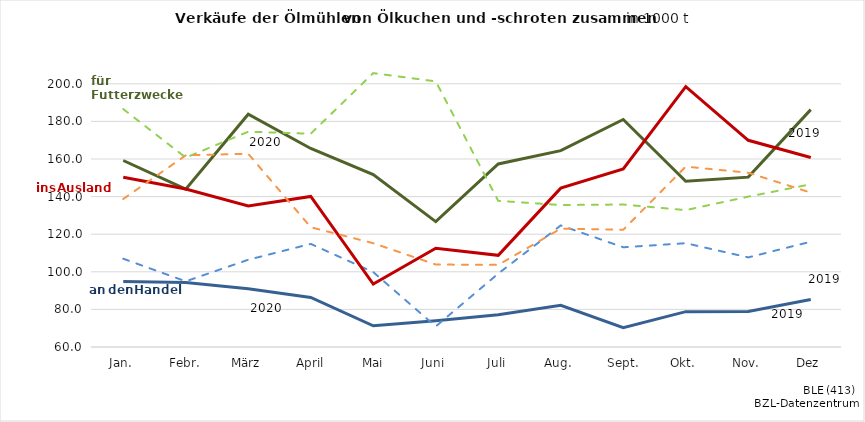
| Category | Series 0 | Series 1 | Series 2 | Series 3 | Series 4 | Series 5 |
|---|---|---|---|---|---|---|
| Jan. | 159.206 | 186.547 | 94.834 | 106.951 | 150.255 | 138.728 |
|  Febr. | 143.959 | 160.755 | 94.34 | 94.93 | 144.072 | 161.962 |
| März | 183.831 | 174.523 | 91.023 | 106.408 | 134.984 | 162.79 |
|  April | 165.612 | 173.445 | 86.359 | 114.842 | 140.08 | 123.689 |
|  Mai | 151.702 | 205.681 | 71.294 | 99.844 | 93.502 | 115.214 |
| Juni | 126.692 | 201.283 | 73.943 | 70.944 | 112.506 | 103.864 |
| Juli | 157.372 | 137.743 | 77.17 | 99.049 | 108.768 | 103.685 |
| Aug. | 164.431 | 135.522 | 82.14 | 124.674 | 144.483 | 122.956 |
|  Sept. | 181.033 | 135.789 | 70.26 | 113.045 | 154.722 | 122.373 |
| Okt. | 148.177 | 132.807 | 78.792 | 115.209 | 198.465 | 155.95 |
| Nov. | 150.354 | 139.979 | 78.848 | 107.659 | 169.957 | 152.696 |
| Dez | 186.254 | 146.563 | 85.262 | 116.012 | 160.762 | 142.113 |